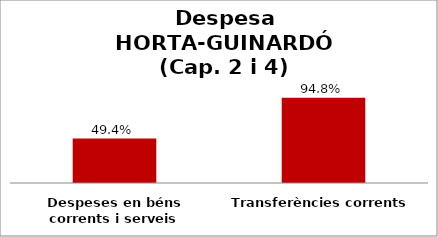
| Category | Series 0 |
|---|---|
| Despeses en béns corrents i serveis | 0.494 |
| Transferències corrents | 0.948 |